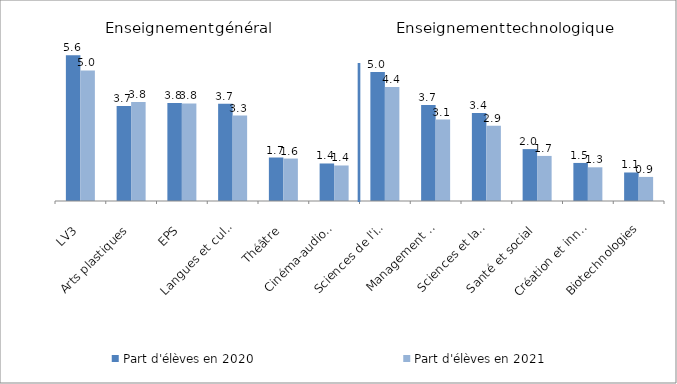
| Category | Part d'élèves en 2020 | Part d'élèves en 2021 |
|---|---|---|
| LV3 | 5.602 | 5.023 |
| Arts plastiques | 3.653 | 3.805 |
| EPS | 3.77 | 3.753 |
| Langues et cultures de l'antiquité : latin | 3.742 | 3.287 |
| Théâtre | 1.673 | 1.633 |
| Cinéma-audiovisuel | 1.443 | 1.366 |
| Sciences de l'ingénieur | 4.962 | 4.388 |
| Management et gestion | 3.692 | 3.133 |
| Sciences et laboratoire | 3.387 | 2.891 |
| Santé et social | 1.996 | 1.734 |
| Création et innovation technologiques | 1.464 | 1.296 |
| Biotechnologies | 1.097 | 0.926 |